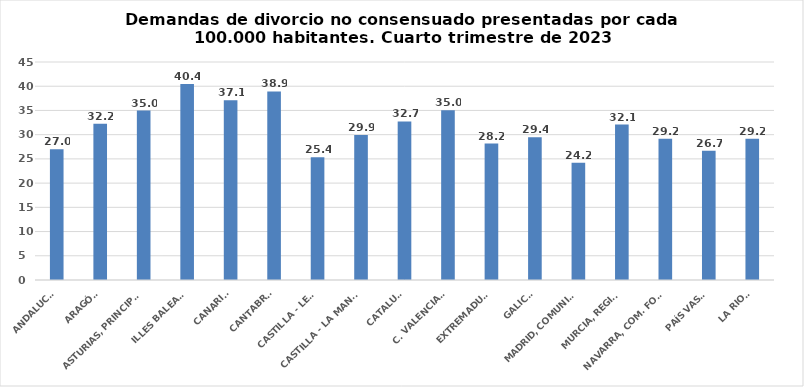
| Category | Series 0 |
|---|---|
| ANDALUCÍA | 26.975 |
| ARAGÓN | 32.238 |
| ASTURIAS, PRINCIPADO | 34.969 |
| ILLES BALEARS | 40.44 |
| CANARIAS | 37.101 |
| CANTABRIA | 38.911 |
| CASTILLA - LEÓN | 25.351 |
| CASTILLA - LA MANCHA | 29.943 |
| CATALUÑA | 32.725 |
| C. VALENCIANA | 35.05 |
| EXTREMADURA | 28.17 |
| GALICIA | 29.448 |
| MADRID, COMUNIDAD | 24.179 |
| MURCIA, REGIÓN | 32.073 |
| NAVARRA, COM. FORAL | 29.158 |
| PAÍS VASCO | 26.668 |
| LA RIOJA | 29.169 |